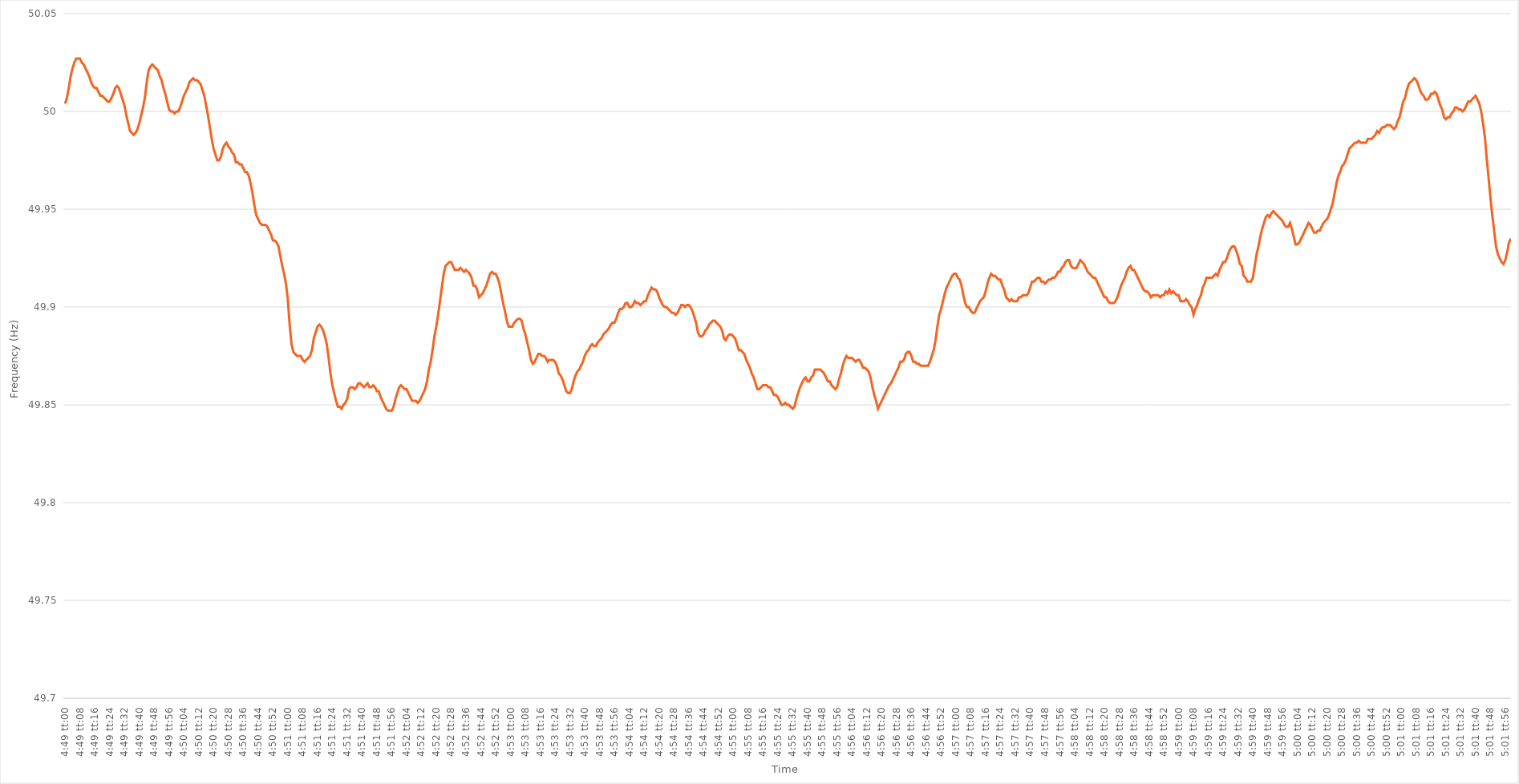
| Category | Series 0 |
|---|---|
| 0.20069444444444443 | 50.004 |
| 0.20070601851851852 | 50.007 |
| 0.2007175925925926 | 50.012 |
| 0.20072916666666665 | 50.018 |
| 0.20074074074074075 | 50.022 |
| 0.20075231481481481 | 50.025 |
| 0.20076388888888888 | 50.027 |
| 0.20077546296296298 | 50.027 |
| 0.20078703703703704 | 50.027 |
| 0.2007986111111111 | 50.025 |
| 0.2008101851851852 | 50.024 |
| 0.20082175925925927 | 50.022 |
| 0.20083333333333334 | 50.02 |
| 0.20084490740740743 | 50.018 |
| 0.2008564814814815 | 50.015 |
| 0.20086805555555554 | 50.013 |
| 0.20087962962962966 | 50.012 |
| 0.2008912037037037 | 50.012 |
| 0.20090277777777776 | 50.01 |
| 0.20091435185185183 | 50.008 |
| 0.20092592592592592 | 50.008 |
| 0.2009375 | 50.007 |
| 0.20094907407407406 | 50.006 |
| 0.20096064814814815 | 50.005 |
| 0.20097222222222222 | 50.005 |
| 0.20098379629629629 | 50.007 |
| 0.20099537037037038 | 50.009 |
| 0.20100694444444445 | 50.012 |
| 0.2010185185185185 | 50.013 |
| 0.2010300925925926 | 50.012 |
| 0.20104166666666667 | 50.009 |
| 0.20105324074074074 | 50.006 |
| 0.20106481481481484 | 50.003 |
| 0.2010763888888889 | 49.998 |
| 0.20108796296296297 | 49.994 |
| 0.20109953703703706 | 49.99 |
| 0.2011111111111111 | 49.989 |
| 0.2011226851851852 | 49.988 |
| 0.20113425925925923 | 49.989 |
| 0.20114583333333333 | 49.991 |
| 0.2011574074074074 | 49.994 |
| 0.20116898148148146 | 49.998 |
| 0.20118055555555556 | 50.002 |
| 0.20119212962962962 | 50.007 |
| 0.2012037037037037 | 50.015 |
| 0.20121527777777778 | 50.021 |
| 0.20122685185185185 | 50.023 |
| 0.20123842592592592 | 50.024 |
| 0.20125 | 50.023 |
| 0.20126157407407408 | 50.022 |
| 0.20127314814814815 | 50.021 |
| 0.20128472222222224 | 50.018 |
| 0.2012962962962963 | 50.016 |
| 0.20130787037037037 | 50.012 |
| 0.20131944444444447 | 50.009 |
| 0.2013310185185185 | 50.005 |
| 0.2013425925925926 | 50.001 |
| 0.20135416666666664 | 50 |
| 0.20136574074074076 | 50 |
| 0.2013773148148148 | 49.999 |
| 0.20138888888888887 | 50 |
| 0.20140046296296296 | 50 |
| 0.20141203703703703 | 50.002 |
| 0.2014236111111111 | 50.005 |
| 0.2014351851851852 | 50.008 |
| 0.20144675925925926 | 50.01 |
| 0.20145833333333332 | 50.012 |
| 0.20146990740740742 | 50.015 |
| 0.20148148148148148 | 50.016 |
| 0.20149305555555555 | 50.017 |
| 0.20150462962962964 | 50.016 |
| 0.2015162037037037 | 50.016 |
| 0.20152777777777778 | 50.015 |
| 0.20153935185185187 | 50.014 |
| 0.20155092592592594 | 50.011 |
| 0.2015625 | 50.008 |
| 0.20157407407407404 | 50.003 |
| 0.20158564814814817 | 49.998 |
| 0.2015972222222222 | 49.992 |
| 0.20160879629629633 | 49.986 |
| 0.20162037037037037 | 49.981 |
| 0.20163194444444443 | 49.978 |
| 0.2016435185185185 | 49.975 |
| 0.2016550925925926 | 49.975 |
| 0.20166666666666666 | 49.977 |
| 0.20167824074074073 | 49.981 |
| 0.20168981481481482 | 49.983 |
| 0.2017013888888889 | 49.984 |
| 0.20171296296296296 | 49.982 |
| 0.20172453703703705 | 49.981 |
| 0.20173611111111112 | 49.979 |
| 0.20174768518518518 | 49.978 |
| 0.20175925925925928 | 49.974 |
| 0.20177083333333334 | 49.974 |
| 0.2017824074074074 | 49.973 |
| 0.2017939814814815 | 49.973 |
| 0.20180555555555557 | 49.971 |
| 0.2018171296296296 | 49.969 |
| 0.20182870370370373 | 49.969 |
| 0.20184027777777777 | 49.967 |
| 0.20185185185185184 | 49.963 |
| 0.2018634259259259 | 49.958 |
| 0.201875 | 49.952 |
| 0.20188657407407407 | 49.947 |
| 0.20189814814814813 | 49.945 |
| 0.20190972222222223 | 49.943 |
| 0.2019212962962963 | 49.942 |
| 0.20193287037037036 | 49.942 |
| 0.20194444444444445 | 49.942 |
| 0.20195601851851852 | 49.941 |
| 0.2019675925925926 | 49.939 |
| 0.20197916666666668 | 49.937 |
| 0.20199074074074075 | 49.934 |
| 0.20200231481481482 | 49.934 |
| 0.2020138888888889 | 49.933 |
| 0.20202546296296298 | 49.931 |
| 0.20203703703703701 | 49.926 |
| 0.20204861111111114 | 49.921 |
| 0.20206018518518518 | 49.917 |
| 0.20207175925925927 | 49.912 |
| 0.2020833333333333 | 49.904 |
| 0.2020949074074074 | 49.891 |
| 0.20210648148148147 | 49.881 |
| 0.20211805555555554 | 49.877 |
| 0.20212962962962963 | 49.876 |
| 0.2021412037037037 | 49.875 |
| 0.20215277777777776 | 49.875 |
| 0.20216435185185186 | 49.875 |
| 0.20217592592592593 | 49.873 |
| 0.2021875 | 49.872 |
| 0.2021990740740741 | 49.873 |
| 0.20221064814814815 | 49.874 |
| 0.20222222222222222 | 49.875 |
| 0.20223379629629631 | 49.878 |
| 0.20224537037037038 | 49.884 |
| 0.20225694444444445 | 49.887 |
| 0.20226851851851854 | 49.89 |
| 0.20228009259259258 | 49.891 |
| 0.20229166666666668 | 49.89 |
| 0.20230324074074071 | 49.888 |
| 0.20231481481481484 | 49.885 |
| 0.20232638888888888 | 49.881 |
| 0.20233796296296294 | 49.874 |
| 0.20234953703703704 | 49.866 |
| 0.2023611111111111 | 49.86 |
| 0.20237268518518517 | 49.856 |
| 0.20238425925925926 | 49.852 |
| 0.20239583333333333 | 49.849 |
| 0.2024074074074074 | 49.849 |
| 0.2024189814814815 | 49.848 |
| 0.20243055555555556 | 49.85 |
| 0.20244212962962962 | 49.851 |
| 0.20245370370370372 | 49.853 |
| 0.20246527777777779 | 49.858 |
| 0.20247685185185185 | 49.859 |
| 0.20248842592592595 | 49.859 |
| 0.2025 | 49.858 |
| 0.20251157407407408 | 49.859 |
| 0.20252314814814812 | 49.861 |
| 0.20253472222222224 | 49.861 |
| 0.20254629629629628 | 49.86 |
| 0.20255787037037035 | 49.859 |
| 0.20256944444444444 | 49.86 |
| 0.2025810185185185 | 49.861 |
| 0.20259259259259257 | 49.859 |
| 0.20260416666666667 | 49.859 |
| 0.20261574074074074 | 49.86 |
| 0.2026273148148148 | 49.859 |
| 0.2026388888888889 | 49.857 |
| 0.20265046296296296 | 49.857 |
| 0.20266203703703703 | 49.854 |
| 0.20267361111111112 | 49.852 |
| 0.2026851851851852 | 49.85 |
| 0.20269675925925926 | 49.848 |
| 0.20270833333333335 | 49.847 |
| 0.20271990740740742 | 49.847 |
| 0.20273148148148148 | 49.847 |
| 0.20274305555555558 | 49.849 |
| 0.20275462962962965 | 49.853 |
| 0.20276620370370368 | 49.856 |
| 0.2027777777777778 | 49.859 |
| 0.20278935185185185 | 49.86 |
| 0.2028009259259259 | 49.859 |
| 0.20281249999999998 | 49.858 |
| 0.20282407407407407 | 49.858 |
| 0.20283564814814814 | 49.856 |
| 0.2028472222222222 | 49.854 |
| 0.2028587962962963 | 49.852 |
| 0.20287037037037037 | 49.852 |
| 0.20288194444444443 | 49.852 |
| 0.20289351851851853 | 49.851 |
| 0.2029050925925926 | 49.852 |
| 0.20291666666666666 | 49.854 |
| 0.20292824074074076 | 49.856 |
| 0.20293981481481482 | 49.858 |
| 0.2029513888888889 | 49.862 |
| 0.20296296296296298 | 49.868 |
| 0.20297453703703705 | 49.872 |
| 0.2029861111111111 | 49.878 |
| 0.2029976851851852 | 49.885 |
| 0.20300925925925925 | 49.89 |
| 0.20302083333333334 | 49.896 |
| 0.20303240740740738 | 49.903 |
| 0.20304398148148148 | 49.91 |
| 0.20305555555555554 | 49.917 |
| 0.2030671296296296 | 49.921 |
| 0.2030787037037037 | 49.922 |
| 0.20309027777777777 | 49.923 |
| 0.20310185185185184 | 49.923 |
| 0.20311342592592593 | 49.921 |
| 0.203125 | 49.919 |
| 0.20313657407407407 | 49.919 |
| 0.20314814814814816 | 49.919 |
| 0.20315972222222223 | 49.92 |
| 0.2031712962962963 | 49.919 |
| 0.2031828703703704 | 49.918 |
| 0.20319444444444446 | 49.919 |
| 0.20320601851851852 | 49.918 |
| 0.20321759259259262 | 49.917 |
| 0.20322916666666666 | 49.915 |
| 0.20324074074074075 | 49.911 |
| 0.2032523148148148 | 49.911 |
| 0.2032638888888889 | 49.909 |
| 0.20327546296296295 | 49.905 |
| 0.20328703703703702 | 49.906 |
| 0.2032986111111111 | 49.907 |
| 0.20331018518518518 | 49.909 |
| 0.20332175925925924 | 49.911 |
| 0.20333333333333334 | 49.914 |
| 0.2033449074074074 | 49.917 |
| 0.20335648148148147 | 49.918 |
| 0.20336805555555557 | 49.917 |
| 0.20337962962962963 | 49.917 |
| 0.2033912037037037 | 49.915 |
| 0.2034027777777778 | 49.912 |
| 0.20341435185185186 | 49.907 |
| 0.20342592592592593 | 49.902 |
| 0.20343750000000002 | 49.898 |
| 0.2034490740740741 | 49.893 |
| 0.20346064814814815 | 49.89 |
| 0.2034722222222222 | 49.89 |
| 0.20348379629629632 | 49.89 |
| 0.20349537037037035 | 49.892 |
| 0.20350694444444442 | 49.893 |
| 0.20351851851851852 | 49.894 |
| 0.20353009259259258 | 49.894 |
| 0.20354166666666665 | 49.893 |
| 0.20355324074074074 | 49.889 |
| 0.2035648148148148 | 49.886 |
| 0.20357638888888888 | 49.882 |
| 0.20358796296296297 | 49.878 |
| 0.20359953703703704 | 49.873 |
| 0.2036111111111111 | 49.871 |
| 0.2036226851851852 | 49.872 |
| 0.20363425925925926 | 49.874 |
| 0.20364583333333333 | 49.876 |
| 0.20365740740740743 | 49.876 |
| 0.2036689814814815 | 49.875 |
| 0.20368055555555556 | 49.875 |
| 0.20369212962962965 | 49.874 |
| 0.20370370370370372 | 49.872 |
| 0.20371527777777776 | 49.873 |
| 0.20372685185185188 | 49.873 |
| 0.20373842592592592 | 49.873 |
| 0.20375 | 49.872 |
| 0.20376157407407405 | 49.87 |
| 0.20377314814814815 | 49.866 |
| 0.20378472222222221 | 49.865 |
| 0.20379629629629628 | 49.863 |
| 0.20380787037037038 | 49.86 |
| 0.20381944444444444 | 49.857 |
| 0.2038310185185185 | 49.856 |
| 0.2038425925925926 | 49.856 |
| 0.20385416666666667 | 49.858 |
| 0.20386574074074074 | 49.862 |
| 0.20387731481481483 | 49.865 |
| 0.2038888888888889 | 49.867 |
| 0.20390046296296296 | 49.868 |
| 0.20391203703703706 | 49.87 |
| 0.20392361111111112 | 49.872 |
| 0.20393518518518516 | 49.875 |
| 0.20394675925925929 | 49.877 |
| 0.20395833333333332 | 49.878 |
| 0.20396990740740742 | 49.88 |
| 0.20398148148148146 | 49.881 |
| 0.20399305555555555 | 49.88 |
| 0.20400462962962962 | 49.88 |
| 0.20401620370370369 | 49.882 |
| 0.20402777777777778 | 49.883 |
| 0.20403935185185185 | 49.884 |
| 0.2040509259259259 | 49.886 |
| 0.2040625 | 49.887 |
| 0.20407407407407407 | 49.888 |
| 0.20408564814814814 | 49.889 |
| 0.20409722222222224 | 49.891 |
| 0.2041087962962963 | 49.892 |
| 0.20412037037037037 | 49.892 |
| 0.20413194444444446 | 49.894 |
| 0.20414351851851853 | 49.897 |
| 0.2041550925925926 | 49.899 |
| 0.2041666666666667 | 49.899 |
| 0.20417824074074073 | 49.9 |
| 0.20418981481481482 | 49.902 |
| 0.20420138888888886 | 49.902 |
| 0.20421296296296299 | 49.9 |
| 0.20422453703703702 | 49.9 |
| 0.2042361111111111 | 49.901 |
| 0.20424768518518518 | 49.903 |
| 0.20425925925925925 | 49.902 |
| 0.20427083333333332 | 49.902 |
| 0.2042824074074074 | 49.901 |
| 0.20429398148148148 | 49.902 |
| 0.20430555555555555 | 49.903 |
| 0.20431712962962964 | 49.903 |
| 0.2043287037037037 | 49.906 |
| 0.20434027777777777 | 49.908 |
| 0.20435185185185187 | 49.91 |
| 0.20436342592592593 | 49.909 |
| 0.204375 | 49.909 |
| 0.2043865740740741 | 49.908 |
| 0.20439814814814816 | 49.905 |
| 0.20440972222222223 | 49.903 |
| 0.20442129629629627 | 49.901 |
| 0.2044328703703704 | 49.9 |
| 0.20444444444444443 | 49.9 |
| 0.2044560185185185 | 49.899 |
| 0.2044675925925926 | 49.898 |
| 0.20447916666666666 | 49.897 |
| 0.20449074074074072 | 49.897 |
| 0.20450231481481482 | 49.896 |
| 0.20451388888888888 | 49.897 |
| 0.20452546296296295 | 49.899 |
| 0.20453703703703704 | 49.901 |
| 0.2045486111111111 | 49.901 |
| 0.20456018518518518 | 49.9 |
| 0.20457175925925927 | 49.901 |
| 0.20458333333333334 | 49.901 |
| 0.2045949074074074 | 49.9 |
| 0.2046064814814815 | 49.898 |
| 0.20461805555555557 | 49.895 |
| 0.20462962962962963 | 49.892 |
| 0.20464120370370367 | 49.887 |
| 0.2046527777777778 | 49.885 |
| 0.20466435185185183 | 49.885 |
| 0.20467592592592596 | 49.886 |
| 0.2046875 | 49.888 |
| 0.20469907407407406 | 49.889 |
| 0.20471064814814813 | 49.891 |
| 0.20472222222222222 | 49.892 |
| 0.2047337962962963 | 49.893 |
| 0.20474537037037036 | 49.893 |
| 0.20475694444444445 | 49.892 |
| 0.20476851851851852 | 49.891 |
| 0.20478009259259258 | 49.89 |
| 0.20479166666666668 | 49.888 |
| 0.20480324074074074 | 49.884 |
| 0.2048148148148148 | 49.883 |
| 0.2048263888888889 | 49.885 |
| 0.20483796296296297 | 49.886 |
| 0.20484953703703704 | 49.886 |
| 0.20486111111111113 | 49.885 |
| 0.2048726851851852 | 49.884 |
| 0.20488425925925924 | 49.881 |
| 0.20489583333333336 | 49.878 |
| 0.2049074074074074 | 49.878 |
| 0.2049189814814815 | 49.877 |
| 0.20493055555555553 | 49.876 |
| 0.20494212962962963 | 49.873 |
| 0.2049537037037037 | 49.871 |
| 0.20496527777777776 | 49.869 |
| 0.20497685185185185 | 49.866 |
| 0.20498842592592592 | 49.864 |
| 0.205 | 49.861 |
| 0.20501157407407408 | 49.858 |
| 0.20502314814814815 | 49.858 |
| 0.20503472222222222 | 49.859 |
| 0.2050462962962963 | 49.86 |
| 0.20505787037037038 | 49.86 |
| 0.20506944444444444 | 49.86 |
| 0.20508101851851854 | 49.859 |
| 0.2050925925925926 | 49.859 |
| 0.20510416666666667 | 49.857 |
| 0.20511574074074077 | 49.855 |
| 0.2051273148148148 | 49.855 |
| 0.2051388888888889 | 49.854 |
| 0.20515046296296294 | 49.852 |
| 0.20516203703703703 | 49.85 |
| 0.2051736111111111 | 49.85 |
| 0.20518518518518516 | 49.851 |
| 0.20519675925925926 | 49.85 |
| 0.20520833333333333 | 49.85 |
| 0.2052199074074074 | 49.849 |
| 0.2052314814814815 | 49.848 |
| 0.20524305555555555 | 49.849 |
| 0.20525462962962962 | 49.853 |
| 0.20526620370370371 | 49.856 |
| 0.20527777777777778 | 49.859 |
| 0.20528935185185185 | 49.861 |
| 0.20530092592592594 | 49.863 |
| 0.2053125 | 49.864 |
| 0.20532407407407408 | 49.862 |
| 0.20533564814814817 | 49.862 |
| 0.20534722222222224 | 49.864 |
| 0.2053587962962963 | 49.865 |
| 0.20537037037037034 | 49.868 |
| 0.20538194444444446 | 49.868 |
| 0.2053935185185185 | 49.868 |
| 0.20540509259259257 | 49.868 |
| 0.20541666666666666 | 49.867 |
| 0.20542824074074073 | 49.866 |
| 0.2054398148148148 | 49.864 |
| 0.2054513888888889 | 49.862 |
| 0.20546296296296296 | 49.862 |
| 0.20547453703703702 | 49.86 |
| 0.20548611111111112 | 49.859 |
| 0.20549768518518519 | 49.858 |
| 0.20550925925925925 | 49.859 |
| 0.20552083333333335 | 49.863 |
| 0.2055324074074074 | 49.866 |
| 0.20554398148148148 | 49.87 |
| 0.20555555555555557 | 49.873 |
| 0.20556712962962964 | 49.875 |
| 0.2055787037037037 | 49.874 |
| 0.20559027777777775 | 49.874 |
| 0.20560185185185187 | 49.874 |
| 0.2056134259259259 | 49.873 |
| 0.20562500000000003 | 49.872 |
| 0.20563657407407407 | 49.873 |
| 0.20564814814814814 | 49.873 |
| 0.2056597222222222 | 49.871 |
| 0.2056712962962963 | 49.869 |
| 0.20568287037037036 | 49.869 |
| 0.20569444444444443 | 49.868 |
| 0.20570601851851852 | 49.867 |
| 0.2057175925925926 | 49.864 |
| 0.20572916666666666 | 49.859 |
| 0.20574074074074075 | 49.855 |
| 0.20575231481481482 | 49.852 |
| 0.20576388888888889 | 49.848 |
| 0.20577546296296298 | 49.85 |
| 0.20578703703703705 | 49.852 |
| 0.2057986111111111 | 49.854 |
| 0.2058101851851852 | 49.856 |
| 0.20582175925925927 | 49.858 |
| 0.2058333333333333 | 49.86 |
| 0.20584490740740743 | 49.861 |
| 0.20585648148148147 | 49.863 |
| 0.20586805555555557 | 49.865 |
| 0.2058796296296296 | 49.867 |
| 0.2058912037037037 | 49.869 |
| 0.20590277777777777 | 49.872 |
| 0.20591435185185183 | 49.872 |
| 0.20592592592592593 | 49.873 |
| 0.2059375 | 49.876 |
| 0.20594907407407406 | 49.877 |
| 0.20596064814814816 | 49.877 |
| 0.20597222222222222 | 49.875 |
| 0.2059837962962963 | 49.872 |
| 0.20599537037037038 | 49.872 |
| 0.20600694444444445 | 49.871 |
| 0.20601851851851852 | 49.871 |
| 0.2060300925925926 | 49.87 |
| 0.20604166666666668 | 49.87 |
| 0.20605324074074075 | 49.87 |
| 0.20606481481481484 | 49.87 |
| 0.20607638888888888 | 49.87 |
| 0.20608796296296297 | 49.872 |
| 0.206099537037037 | 49.875 |
| 0.2061111111111111 | 49.878 |
| 0.20612268518518517 | 49.883 |
| 0.20613425925925924 | 49.89 |
| 0.20614583333333333 | 49.896 |
| 0.2061574074074074 | 49.899 |
| 0.20616898148148147 | 49.903 |
| 0.20618055555555556 | 49.907 |
| 0.20619212962962963 | 49.91 |
| 0.2062037037037037 | 49.912 |
| 0.2062152777777778 | 49.914 |
| 0.20622685185185186 | 49.916 |
| 0.20623842592592592 | 49.917 |
| 0.20625000000000002 | 49.917 |
| 0.20626157407407408 | 49.915 |
| 0.20627314814814815 | 49.914 |
| 0.20628472222222224 | 49.911 |
| 0.2062962962962963 | 49.906 |
| 0.20630787037037038 | 49.902 |
| 0.20631944444444442 | 49.9 |
| 0.20633101851851854 | 49.9 |
| 0.20634259259259258 | 49.898 |
| 0.20635416666666664 | 49.897 |
| 0.20636574074074074 | 49.897 |
| 0.2063773148148148 | 49.899 |
| 0.20638888888888887 | 49.901 |
| 0.20640046296296297 | 49.903 |
| 0.20641203703703703 | 49.904 |
| 0.2064236111111111 | 49.905 |
| 0.2064351851851852 | 49.908 |
| 0.20644675925925926 | 49.912 |
| 0.20645833333333333 | 49.915 |
| 0.20646990740740742 | 49.917 |
| 0.2064814814814815 | 49.916 |
| 0.20649305555555555 | 49.916 |
| 0.20650462962962965 | 49.915 |
| 0.20651620370370372 | 49.914 |
| 0.20652777777777778 | 49.914 |
| 0.20653935185185182 | 49.911 |
| 0.20655092592592594 | 49.909 |
| 0.20656249999999998 | 49.905 |
| 0.2065740740740741 | 49.904 |
| 0.20658564814814814 | 49.903 |
| 0.2065972222222222 | 49.904 |
| 0.20660879629629628 | 49.903 |
| 0.20662037037037037 | 49.903 |
| 0.20663194444444444 | 49.903 |
| 0.2066435185185185 | 49.905 |
| 0.2066550925925926 | 49.905 |
| 0.20666666666666667 | 49.906 |
| 0.20667824074074073 | 49.906 |
| 0.20668981481481483 | 49.906 |
| 0.2067013888888889 | 49.907 |
| 0.20671296296296296 | 49.91 |
| 0.20672453703703705 | 49.913 |
| 0.20673611111111112 | 49.913 |
| 0.2067476851851852 | 49.914 |
| 0.20675925925925928 | 49.915 |
| 0.20677083333333335 | 49.915 |
| 0.2067824074074074 | 49.913 |
| 0.2067939814814815 | 49.913 |
| 0.20680555555555555 | 49.912 |
| 0.20681712962962964 | 49.913 |
| 0.20682870370370368 | 49.914 |
| 0.20684027777777778 | 49.914 |
| 0.20685185185185184 | 49.915 |
| 0.2068634259259259 | 49.915 |
| 0.206875 | 49.916 |
| 0.20688657407407407 | 49.918 |
| 0.20689814814814814 | 49.918 |
| 0.20690972222222223 | 49.92 |
| 0.2069212962962963 | 49.921 |
| 0.20693287037037036 | 49.923 |
| 0.20694444444444446 | 49.924 |
| 0.20695601851851853 | 49.924 |
| 0.2069675925925926 | 49.921 |
| 0.2069791666666667 | 49.92 |
| 0.20699074074074075 | 49.92 |
| 0.20700231481481482 | 49.92 |
| 0.20701388888888891 | 49.922 |
| 0.20702546296296295 | 49.924 |
| 0.20703703703703705 | 49.923 |
| 0.20704861111111109 | 49.922 |
| 0.20706018518518518 | 49.92 |
| 0.20707175925925925 | 49.918 |
| 0.2070833333333333 | 49.917 |
| 0.2070949074074074 | 49.916 |
| 0.20710648148148147 | 49.915 |
| 0.20711805555555554 | 49.915 |
| 0.20712962962962964 | 49.913 |
| 0.2071412037037037 | 49.911 |
| 0.20715277777777777 | 49.909 |
| 0.20716435185185186 | 49.907 |
| 0.20717592592592593 | 49.905 |
| 0.2071875 | 49.905 |
| 0.2071990740740741 | 49.903 |
| 0.20721064814814816 | 49.902 |
| 0.20722222222222222 | 49.902 |
| 0.20723379629629632 | 49.902 |
| 0.20724537037037036 | 49.903 |
| 0.20725694444444445 | 49.905 |
| 0.2072685185185185 | 49.908 |
| 0.2072800925925926 | 49.911 |
| 0.20729166666666665 | 49.913 |
| 0.20730324074074072 | 49.915 |
| 0.2073148148148148 | 49.918 |
| 0.20732638888888888 | 49.92 |
| 0.20733796296296295 | 49.921 |
| 0.20734953703703704 | 49.919 |
| 0.2073611111111111 | 49.919 |
| 0.20737268518518517 | 49.917 |
| 0.20738425925925927 | 49.915 |
| 0.20739583333333333 | 49.913 |
| 0.2074074074074074 | 49.911 |
| 0.2074189814814815 | 49.909 |
| 0.20743055555555556 | 49.908 |
| 0.20744212962962963 | 49.908 |
| 0.20745370370370372 | 49.907 |
| 0.2074652777777778 | 49.905 |
| 0.20747685185185186 | 49.906 |
| 0.2074884259259259 | 49.906 |
| 0.20750000000000002 | 49.906 |
| 0.20751157407407406 | 49.906 |
| 0.20752314814814818 | 49.905 |
| 0.20753472222222222 | 49.906 |
| 0.20754629629629628 | 49.906 |
| 0.20755787037037035 | 49.908 |
| 0.20756944444444445 | 49.907 |
| 0.2075810185185185 | 49.909 |
| 0.20759259259259258 | 49.907 |
| 0.20760416666666667 | 49.908 |
| 0.20761574074074074 | 49.907 |
| 0.2076273148148148 | 49.906 |
| 0.2076388888888889 | 49.906 |
| 0.20765046296296297 | 49.903 |
| 0.20766203703703703 | 49.903 |
| 0.20767361111111113 | 49.903 |
| 0.2076851851851852 | 49.904 |
| 0.20769675925925926 | 49.903 |
| 0.20770833333333336 | 49.901 |
| 0.20771990740740742 | 49.9 |
| 0.20773148148148146 | 49.896 |
| 0.20774305555555558 | 49.899 |
| 0.20775462962962962 | 49.901 |
| 0.2077662037037037 | 49.904 |
| 0.20777777777777776 | 49.906 |
| 0.20778935185185185 | 49.91 |
| 0.20780092592592592 | 49.912 |
| 0.20781249999999998 | 49.915 |
| 0.20782407407407408 | 49.915 |
| 0.20783564814814814 | 49.915 |
| 0.2078472222222222 | 49.915 |
| 0.2078587962962963 | 49.916 |
| 0.20787037037037037 | 49.917 |
| 0.20788194444444444 | 49.916 |
| 0.20789351851851853 | 49.919 |
| 0.2079050925925926 | 49.921 |
| 0.20791666666666667 | 49.923 |
| 0.20792824074074076 | 49.923 |
| 0.20793981481481483 | 49.925 |
| 0.2079513888888889 | 49.928 |
| 0.207962962962963 | 49.93 |
| 0.20797453703703703 | 49.931 |
| 0.20798611111111112 | 49.931 |
| 0.20799768518518516 | 49.929 |
| 0.20800925925925925 | 49.926 |
| 0.20802083333333332 | 49.922 |
| 0.2080324074074074 | 49.921 |
| 0.20804398148148148 | 49.916 |
| 0.20805555555555555 | 49.915 |
| 0.20806712962962962 | 49.913 |
| 0.2080787037037037 | 49.913 |
| 0.20809027777777778 | 49.913 |
| 0.20810185185185184 | 49.915 |
| 0.20811342592592594 | 49.921 |
| 0.208125 | 49.927 |
| 0.20813657407407407 | 49.931 |
| 0.20814814814814817 | 49.936 |
| 0.20815972222222223 | 49.94 |
| 0.2081712962962963 | 49.943 |
| 0.2081828703703704 | 49.946 |
| 0.20819444444444443 | 49.947 |
| 0.20820601851851853 | 49.946 |
| 0.20821759259259257 | 49.948 |
| 0.2082291666666667 | 49.949 |
| 0.20824074074074073 | 49.948 |
| 0.2082523148148148 | 49.947 |
| 0.2082638888888889 | 49.946 |
| 0.20827546296296295 | 49.945 |
| 0.20828703703703702 | 49.944 |
| 0.20829861111111111 | 49.942 |
| 0.20831018518518518 | 49.941 |
| 0.20832175925925925 | 49.941 |
| 0.20833333333333334 | 49.943 |
| 0.2083449074074074 | 49.94 |
| 0.20835648148148148 | 49.936 |
| 0.20836805555555557 | 49.932 |
| 0.20837962962962964 | 49.932 |
| 0.2083912037037037 | 49.933 |
| 0.2084027777777778 | 49.935 |
| 0.20841435185185186 | 49.937 |
| 0.20842592592592593 | 49.939 |
| 0.20843750000000003 | 49.941 |
| 0.2084490740740741 | 49.943 |
| 0.20846064814814813 | 49.942 |
| 0.2084722222222222 | 49.94 |
| 0.2084837962962963 | 49.938 |
| 0.20849537037037036 | 49.938 |
| 0.20850694444444443 | 49.939 |
| 0.20851851851851852 | 49.939 |
| 0.2085300925925926 | 49.941 |
| 0.20854166666666665 | 49.943 |
| 0.20855324074074075 | 49.944 |
| 0.20856481481481481 | 49.945 |
| 0.20857638888888888 | 49.947 |
| 0.20858796296296298 | 49.95 |
| 0.20859953703703704 | 49.953 |
| 0.2086111111111111 | 49.958 |
| 0.2086226851851852 | 49.963 |
| 0.20863425925925927 | 49.967 |
| 0.20864583333333334 | 49.969 |
| 0.20865740740740743 | 49.972 |
| 0.2086689814814815 | 49.973 |
| 0.20868055555555556 | 49.975 |
| 0.2086921296296296 | 49.978 |
| 0.2087037037037037 | 49.981 |
| 0.20871527777777776 | 49.982 |
| 0.20872685185185183 | 49.983 |
| 0.20873842592592592 | 49.984 |
| 0.20875 | 49.984 |
| 0.20876157407407406 | 49.985 |
| 0.20877314814814815 | 49.984 |
| 0.20878472222222222 | 49.984 |
| 0.20879629629629629 | 49.984 |
| 0.20880787037037038 | 49.984 |
| 0.20881944444444445 | 49.986 |
| 0.2088310185185185 | 49.986 |
| 0.2088425925925926 | 49.986 |
| 0.20885416666666667 | 49.987 |
| 0.20886574074074074 | 49.988 |
| 0.20887731481481484 | 49.99 |
| 0.2088888888888889 | 49.989 |
| 0.20890046296296297 | 49.991 |
| 0.20891203703703706 | 49.992 |
| 0.20892361111111113 | 49.992 |
| 0.20893518518518517 | 49.993 |
| 0.20894675925925923 | 49.993 |
| 0.20895833333333333 | 49.993 |
| 0.2089699074074074 | 49.992 |
| 0.20898148148148146 | 49.991 |
| 0.20899305555555556 | 49.992 |
| 0.20900462962962962 | 49.995 |
| 0.2090162037037037 | 49.997 |
| 0.20902777777777778 | 50.001 |
| 0.20903935185185185 | 50.005 |
| 0.20905092592592592 | 50.007 |
| 0.2090625 | 50.011 |
| 0.20907407407407408 | 50.014 |
| 0.20908564814814815 | 50.015 |
| 0.20909722222222224 | 50.016 |
| 0.2091087962962963 | 50.017 |
| 0.20912037037037037 | 50.016 |
| 0.20913194444444447 | 50.014 |
| 0.20914351851851853 | 50.011 |
| 0.2091550925925926 | 50.009 |
| 0.20916666666666664 | 50.008 |
| 0.20917824074074073 | 50.006 |
| 0.2091898148148148 | 50.006 |
| 0.20920138888888887 | 50.007 |
| 0.20921296296296296 | 50.009 |
| 0.20922453703703703 | 50.009 |
| 0.2092361111111111 | 50.01 |
| 0.2092476851851852 | 50.009 |
| 0.20925925925925926 | 50.006 |
| 0.20927083333333332 | 50.003 |
| 0.20928240740740742 | 50.001 |
| 0.20929398148148148 | 49.997 |
| 0.20930555555555555 | 49.996 |
| 0.20931712962962964 | 49.997 |
| 0.2093287037037037 | 49.997 |
| 0.20934027777777778 | 49.999 |
| 0.20935185185185187 | 50 |
| 0.20936342592592594 | 50.002 |
| 0.209375 | 50.002 |
| 0.2093865740740741 | 50.001 |
| 0.20939814814814817 | 50.001 |
| 0.2094097222222222 | 50 |
| 0.20942129629629627 | 50.001 |
| 0.20943287037037037 | 50.003 |
| 0.20944444444444443 | 50.005 |
| 0.2094560185185185 | 50.005 |
| 0.2094675925925926 | 50.006 |
| 0.20947916666666666 | 50.007 |
| 0.20949074074074073 | 50.008 |
| 0.20950231481481482 | 50.006 |
| 0.2095138888888889 | 50.004 |
| 0.20952546296296296 | 50 |
| 0.20953703703703705 | 49.994 |
| 0.20954861111111112 | 49.987 |
| 0.20956018518518518 | 49.976 |
| 0.20957175925925928 | 49.966 |
| 0.20958333333333334 | 49.956 |
| 0.2095949074074074 | 49.947 |
| 0.2096064814814815 | 49.939 |
| 0.20961805555555557 | 49.931 |
| 0.20962962962962964 | 49.927 |
| 0.20964120370370368 | 49.925 |
| 0.20965277777777777 | 49.923 |
| 0.20966435185185184 | 49.922 |
| 0.2096759259259259 | 49.924 |
| 0.2096875 | 49.928 |
| 0.20969907407407407 | 49.933 |
| 0.20971064814814813 | 49.935 |